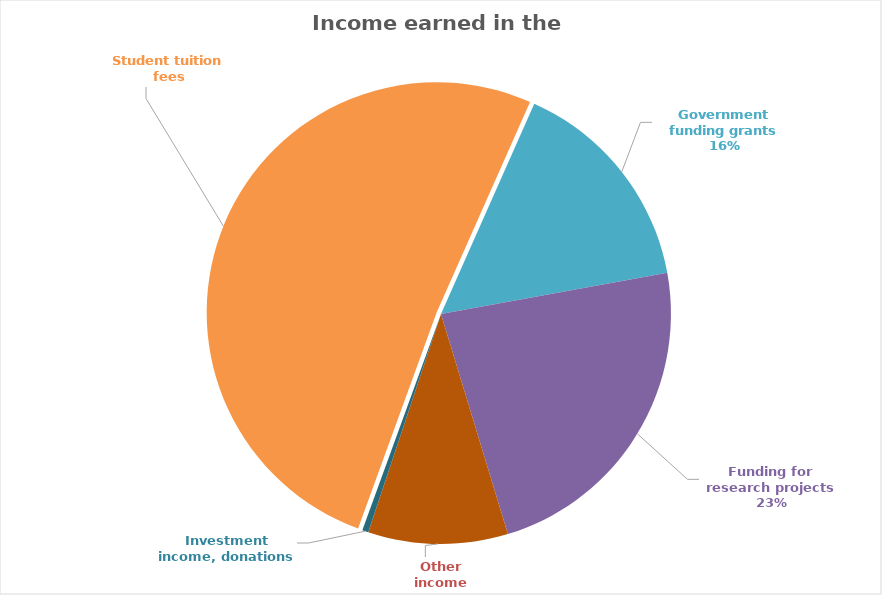
| Category | 2017-18 |
|---|---|
| Student tuition fees | 235999 |
| Government funding grants | 71538 |
| Funding for research projects | 107022 |
| Other income | 45368 |
| Investment income, donations and gifts | 1989 |